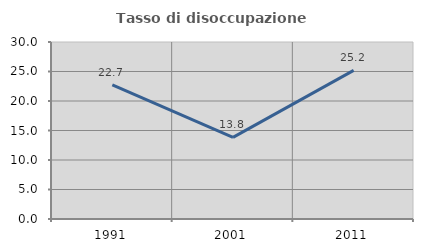
| Category | Tasso di disoccupazione giovanile  |
|---|---|
| 1991.0 | 22.74 |
| 2001.0 | 13.825 |
| 2011.0 | 25.184 |